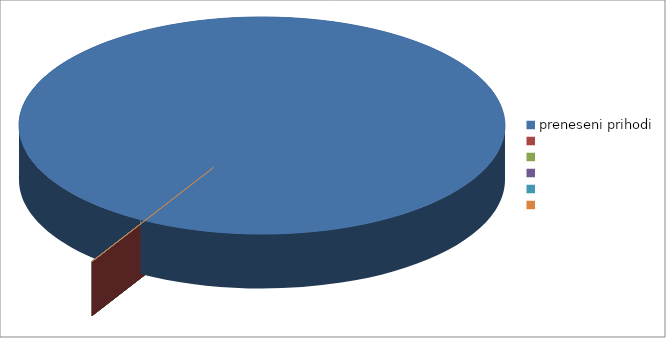
| Category | Series 0 |
|---|---|
| preneseni prihodi | 0.18 |